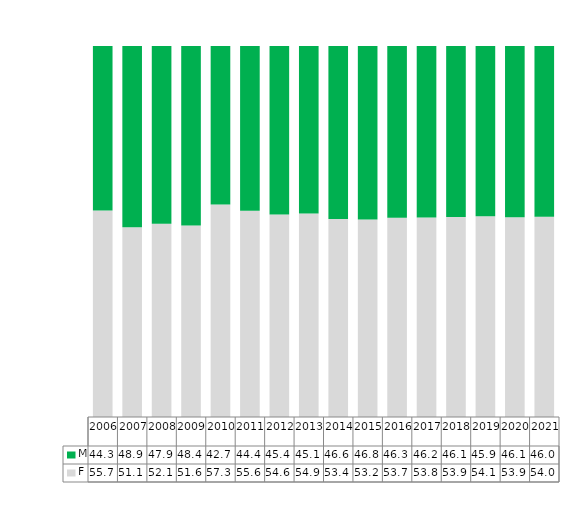
| Category | F | M |
|---|---|---|
| 2006.0 | 0.557 | 0.443 |
| 2007.0 | 0.511 | 0.489 |
| 2008.0 | 0.521 | 0.479 |
| 2009.0 | 0.516 | 0.484 |
| 2010.0 | 0.573 | 0.427 |
| 2011.0 | 0.556 | 0.444 |
| 2012.0 | 0.546 | 0.454 |
| 2013.0 | 0.549 | 0.451 |
| 2014.0 | 0.534 | 0.466 |
| 2015.0 | 0.532 | 0.468 |
| 2016.0 | 0.537 | 0.463 |
| 2017.0 | 0.538 | 0.462 |
| 2018.0 | 0.539 | 0.461 |
| 2019.0 | 0.541 | 0.459 |
| 2020.0 | 0.539 | 0.461 |
| 2021.0 | 0.54 | 0.46 |